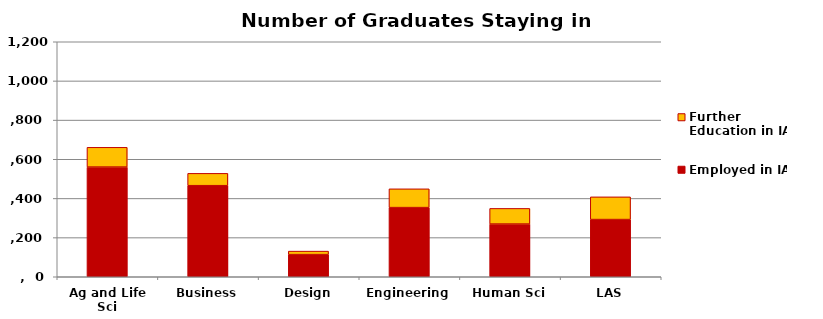
| Category | Employed in IA | Further Education in IA |
|---|---|---|
| Ag and Life Sci | 560 | 101 |
| Business | 465 | 63 |
| Design | 113 | 18 |
| Engineering | 353 | 96 |
| Human Sci | 269 | 80 |
| LAS | 292 | 116 |